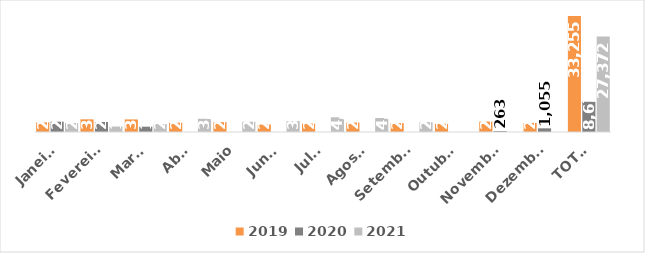
| Category | 2019 | 2020 | 2021 |
|---|---|---|---|
| Janeiro | 2767 | 2960 | 2569 |
| Fevereiro | 3638 | 2874 | 1563 |
| Março | 3612 | 1522 | 2283 |
| Abril | 2666 | 0 | 3799 |
| Maio | 2835 | 0 | 2933 |
| Junho | 2154 | 0 | 3153 |
| Julho | 2405 | 0 | 4231 |
| Agosto | 2725 | 0 | 4013 |
| Setembro | 2548 | 0 | 2828 |
| Outubro | 2341 | 0 | 0 |
| Novembro | 2980 | 263 | 0 |
| Dezembro | 2584 | 1055 | 0 |